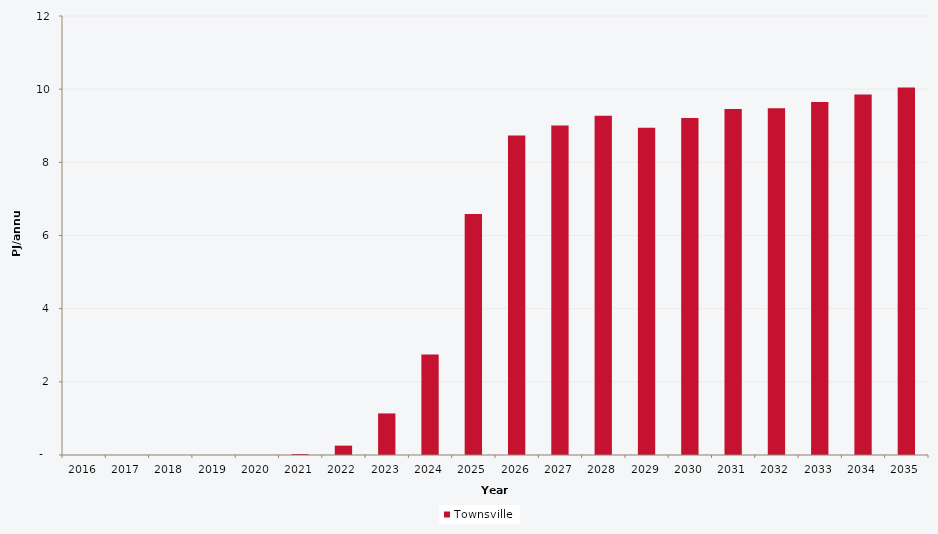
| Category | Townsville |
|---|---|
| 2016.0 | 0 |
| 2017.0 | 0 |
| 2018.0 | 0 |
| 2019.0 | 0 |
| 2020.0 | 0 |
| 2021.0 | 0.026 |
| 2022.0 | 0.256 |
| 2023.0 | 1.137 |
| 2024.0 | 2.749 |
| 2025.0 | 6.589 |
| 2026.0 | 8.737 |
| 2027.0 | 9.004 |
| 2028.0 | 9.271 |
| 2029.0 | 8.946 |
| 2030.0 | 9.208 |
| 2031.0 | 9.46 |
| 2032.0 | 9.479 |
| 2033.0 | 9.652 |
| 2034.0 | 9.855 |
| 2035.0 | 10.044 |